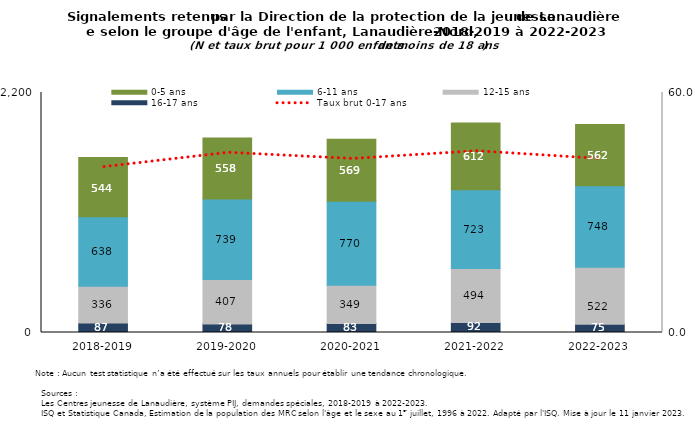
| Category | 16-17 ans | 12-15 ans | 6-11 ans | 0-5 ans |
|---|---|---|---|---|
| 2018-2019 | 87 | 336 | 638 | 544 |
| 2019-2020 | 78 | 407 | 739 | 558 |
| 2020-2021 | 83 | 349 | 770 | 569 |
| 2021-2022 | 92 | 494 | 723 | 612 |
| 2022-2023 | 75 | 522 | 748 | 562 |